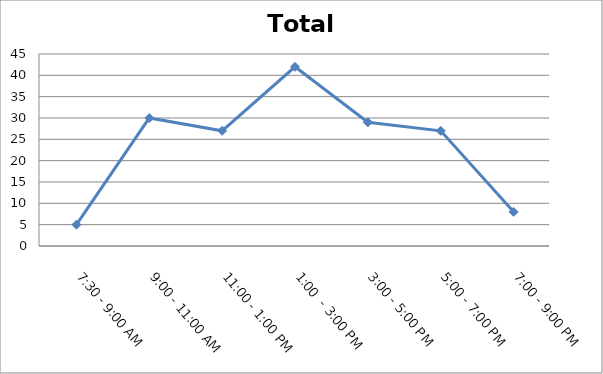
| Category | Total |
|---|---|
| 7:30 - 9:00 AM | 5 |
| 9:00 - 11:00 AM | 30 |
| 11:00 - 1:00 PM | 27 |
| 1:00  - 3:00 PM | 42 |
| 3:00 - 5:00 PM | 29 |
| 5:00 - 7:00 PM | 27 |
| 7:00 - 9:00 PM | 8 |